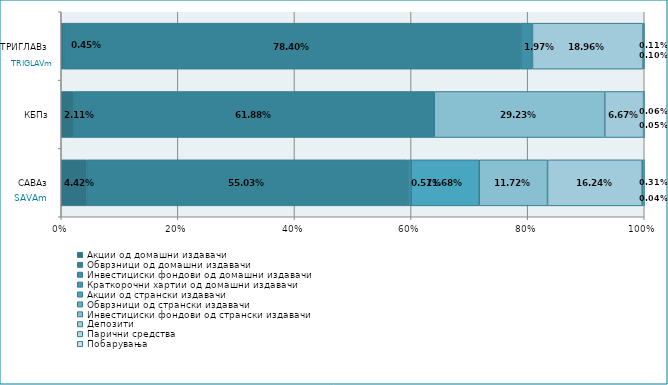
| Category | Акции од домашни издавачи  | Обврзници од домашни издавачи  | Инвестициски фондови од домашни издавачи  | Краткорочни хартии од домашни издавачи  | Акции од странски издавачи  | Обврзници од странски издавачи  | Инвестициски фондови од странски издавaчи | Депозити  | Парични средства  | Побарувања |
|---|---|---|---|---|---|---|---|---|---|---|
| САВАз | 0.044 | 0.55 | 0.006 | 0 | 0.117 | 0 | 0.117 | 0.162 | 0.003 | 0 |
| КБПз | 0.021 | 0.619 | 0 | 0 | 0 | 0 | 0.292 | 0.067 | 0.001 | 0 |
| ТРИГЛАВз | 0.005 | 0.784 | 0.02 | 0 | 0 | 0 | 0 | 0.19 | 0.001 | 0.001 |